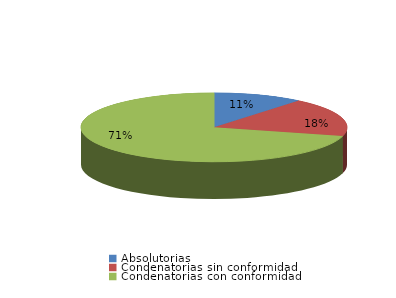
| Category | Series 0 |
|---|---|
| Absolutorias | 6 |
| Condenatorias sin conformidad | 10 |
| Condenatorias con conformidad | 39 |